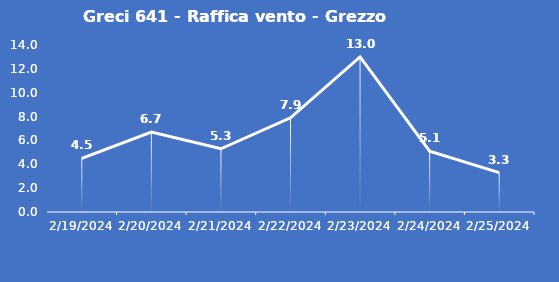
| Category | Greci 641 - Raffica vento - Grezzo (m/s) |
|---|---|
| 2/19/24 | 4.5 |
| 2/20/24 | 6.7 |
| 2/21/24 | 5.3 |
| 2/22/24 | 7.9 |
| 2/23/24 | 13 |
| 2/24/24 | 5.1 |
| 2/25/24 | 3.3 |